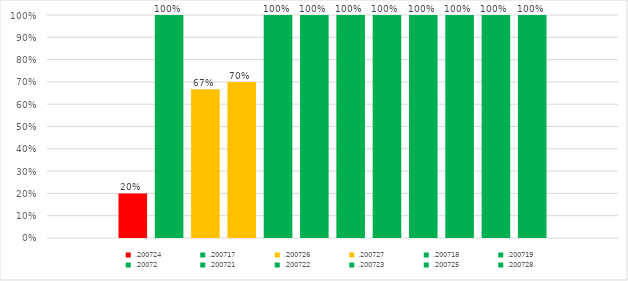
| Category | .200724 | .200717 | .200726 | .200727 | .200718 | .200719 | .20072 | .200721 | .200722 | .200723 | .200725 | .200728 |
|---|---|---|---|---|---|---|---|---|---|---|---|---|
| 0 | 0.2 | 1 | 0.667 | 0.7 | 1 | 1 | 1 | 1 | 1 | 1 | 1 | 1 |